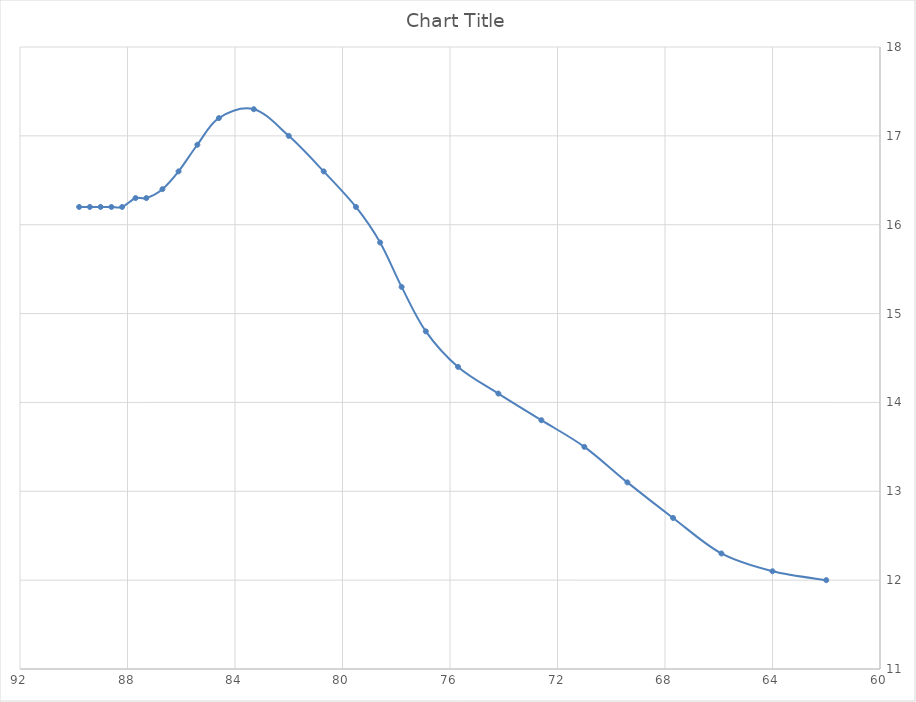
| Category | Series 0 |
|---|---|
| 62.0 | 12 |
| 64.0 | 12.1 |
| 65.9 | 12.3 |
| 67.7 | 12.7 |
| 69.4 | 13.1 |
| 71.0 | 13.5 |
| 72.6 | 13.8 |
| 74.2 | 14.1 |
| 75.7 | 14.4 |
| 76.9 | 14.8 |
| 77.8 | 15.3 |
| 78.6 | 15.8 |
| 79.5 | 16.2 |
| 80.7 | 16.6 |
| 82.0 | 17 |
| 83.3 | 17.3 |
| 84.6 | 17.2 |
| 85.4 | 16.9 |
| 86.1 | 16.6 |
| 86.7 | 16.4 |
| 87.3 | 16.3 |
| 87.7 | 16.3 |
| 88.2 | 16.2 |
| 88.6 | 16.2 |
| 89.0 | 16.2 |
| 89.4 | 16.2 |
| 89.8 | 16.2 |